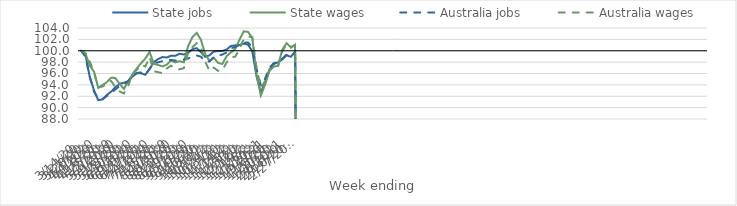
| Category | State jobs | State wages | Australia jobs | Australia wages |
|---|---|---|---|---|
| 14/03/2020 | 100 | 100 | 100 | 100 |
| 21/03/2020 | 99.333 | 99.533 | 98.956 | 99.591 |
| 28/03/2020 | 95.465 | 97.383 | 95.412 | 98.115 |
| 04/04/2020 | 93.05 | 96.331 | 92.813 | 96.238 |
| 11/04/2020 | 91.317 | 93.468 | 91.52 | 93.527 |
| 18/04/2020 | 91.443 | 93.988 | 91.497 | 93.722 |
| 25/04/2020 | 92.231 | 94.458 | 92.022 | 94.132 |
| 02/05/2020 | 92.815 | 95.286 | 92.516 | 94.683 |
| 09/05/2020 | 93.58 | 95.192 | 93.196 | 93.606 |
| 16/05/2020 | 94.197 | 94.173 | 93.786 | 92.839 |
| 23/05/2020 | 94.376 | 93.29 | 94.143 | 92.495 |
| 30/05/2020 | 94.638 | 94.646 | 94.652 | 93.805 |
| 06/06/2020 | 95.472 | 95.874 | 95.638 | 95.989 |
| 13/06/2020 | 96.037 | 96.881 | 96.141 | 96.647 |
| 20/06/2020 | 96.035 | 97.814 | 96.161 | 97.556 |
| 27/06/2020 | 95.785 | 98.621 | 95.749 | 97.243 |
| 04/07/2020 | 96.775 | 99.794 | 96.855 | 98.903 |
| 11/07/2020 | 98.037 | 97.691 | 97.864 | 96.396 |
| 18/07/2020 | 98.539 | 97.496 | 97.96 | 96.236 |
| 25/07/2020 | 98.896 | 97.244 | 98.177 | 96.05 |
| 01/08/2020 | 98.813 | 97.546 | 98.391 | 96.89 |
| 08/08/2020 | 99.125 | 98.273 | 98.384 | 97.377 |
| 15/08/2020 | 99.104 | 97.951 | 98.275 | 96.882 |
| 22/08/2020 | 99.468 | 98.167 | 98.328 | 96.723 |
| 29/08/2020 | 99.345 | 97.965 | 98.458 | 96.942 |
| 05/09/2020 | 99.643 | 100.817 | 98.618 | 99.637 |
| 12/09/2020 | 100.26 | 102.385 | 99.017 | 100.615 |
| 19/09/2020 | 100.456 | 103.15 | 99.166 | 101.346 |
| 26/09/2020 | 99.745 | 101.924 | 98.953 | 100.497 |
| 03/10/2020 | 98.928 | 99.394 | 98.095 | 98.1 |
| 10/10/2020 | 99.212 | 98.22 | 98.121 | 96.45 |
| 17/10/2020 | 99.859 | 98.79 | 98.87 | 97.028 |
| 24/10/2020 | 99.94 | 97.859 | 99.128 | 96.463 |
| 31/10/2020 | 99.957 | 97.681 | 99.332 | 96.583 |
| 07/11/2020 | 100.221 | 99.055 | 99.7 | 97.947 |
| 14/11/2020 | 100.834 | 99.701 | 100.404 | 98.872 |
| 21/11/2020 | 100.95 | 100.31 | 100.686 | 98.947 |
| 28/11/2020 | 101.024 | 101.929 | 100.954 | 100.289 |
| 05/12/2020 | 101.255 | 103.41 | 101.418 | 102.049 |
| 12/12/2020 | 101.075 | 103.308 | 101.44 | 102.491 |
| 19/12/2020 | 99.884 | 102.242 | 100.619 | 102.382 |
| 26/12/2020 | 95.495 | 95.783 | 96.814 | 96.897 |
| 02/01/2021 | 92.672 | 92.156 | 93.894 | 93.496 |
| 09/01/2021 | 94.435 | 94.074 | 95.102 | 94.672 |
| 16/01/2021 | 96.648 | 96.46 | 97.043 | 96.593 |
| 23/01/2021 | 97.655 | 97.209 | 97.81 | 97.069 |
| 30/01/2021 | 97.967 | 97.349 | 98.097 | 97.188 |
| 06/02/2021 | 98.467 | 100.154 | 98.579 | 99.942 |
| 13/02/2021 | 99.203 | 101.326 | 99.324 | 101.024 |
| 20/02/2021 | 98.941 | 100.647 | 98.998 | 100.508 |
| 27/02/2021 | 99.789 | 101.014 | 99.758 | 101.044 |